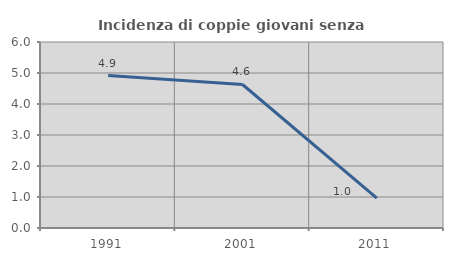
| Category | Incidenza di coppie giovani senza figli |
|---|---|
| 1991.0 | 4.918 |
| 2001.0 | 4.63 |
| 2011.0 | 0.962 |